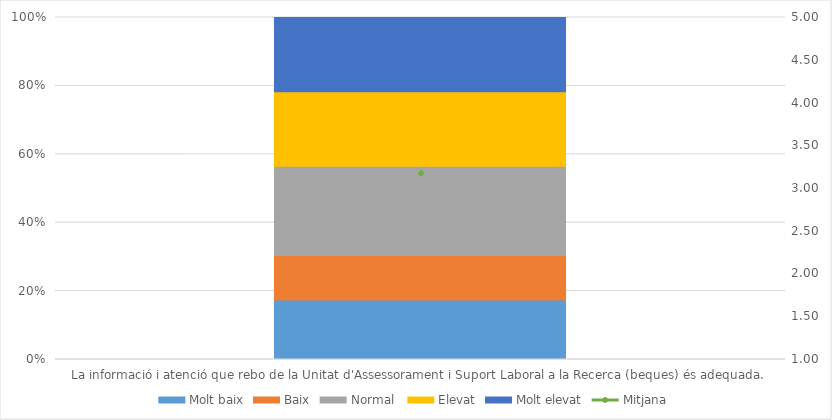
| Category | Molt baix | Baix | Normal  | Elevat | Molt elevat |
|---|---|---|---|---|---|
| La informació i atenció que rebo de la Unitat d'Assessorament i Suport Laboral a la Recerca (beques) és adequada. | 4 | 3 | 6 | 5 | 5 |